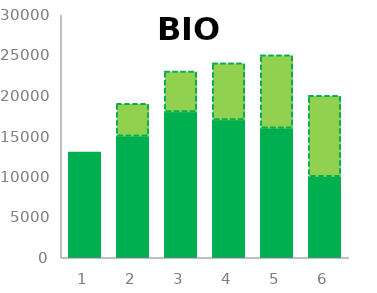
| Category | BIO | BIO imit |
|---|---|---|
| 0 | 13000 | 0 |
| 1 | 15000 | 4000 |
| 2 | 18000 | 5000 |
| 3 | 17000 | 7000 |
| 4 | 16000 | 9000 |
| 5 | 10000 | 10000 |